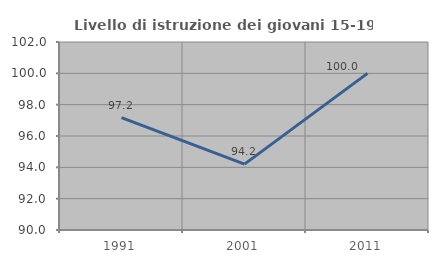
| Category | Livello di istruzione dei giovani 15-19 anni |
|---|---|
| 1991.0 | 97.17 |
| 2001.0 | 94.203 |
| 2011.0 | 100 |